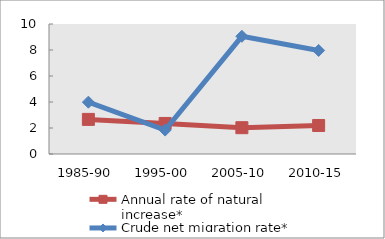
| Category | Annual rate of natural increase* | Crude net migration rate* |
|---|---|---|
| 1985-90 | 2.662 | 3.987 |
| 1995-00 | 2.35 | 1.839 |
| 2005-10 | 2.023 | 9.052 |
| 2010-15 | 2.193 | 7.966 |